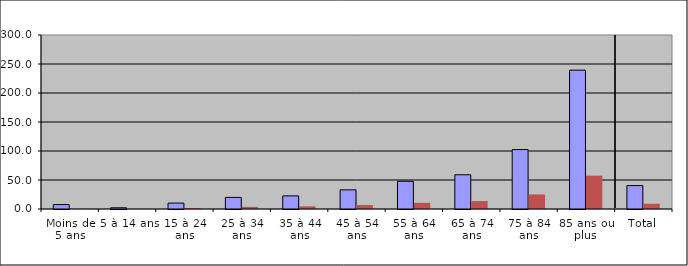
| Category | Secteur public | Secteur privé |
|---|---|---|
| Moins de 5 ans | 7.6 | 0.4 |
| 5 à 14 ans | 2.1 | 0.2 |
| 15 à 24 ans | 10.2 | 1.7 |
| 25 à 34 ans | 20 | 3.7 |
| 35 à 44 ans | 22.6 | 4.6 |
| 45 à 54 ans | 33 | 6.8 |
| 55 à 64 ans | 47.8 | 10.7 |
| 65 à 74 ans | 59 | 13.7 |
| 75 à 84 ans | 102.4 | 25.1 |
| 85 ans ou plus | 239.4 | 57.5 |
| Total | 40.4 | 9.1 |